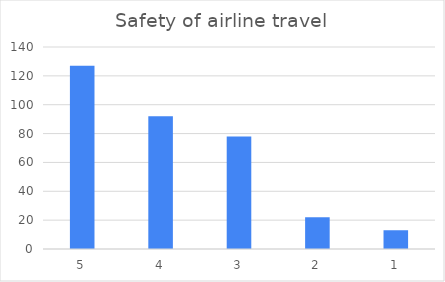
| Category | Series 0 |
|---|---|
| 5 | 127 |
| 4 | 92 |
| 3 | 78 |
| 2 | 22 |
| 1 | 13 |